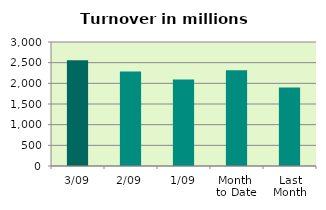
| Category | Series 0 |
|---|---|
| 3/09 | 2560.395 |
| 2/09 | 2288.964 |
| 1/09 | 2093.652 |
| Month 
to Date | 2314.337 |
| Last
Month | 1896.825 |